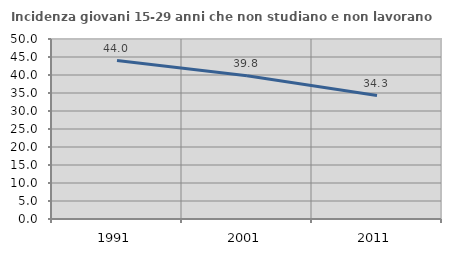
| Category | Incidenza giovani 15-29 anni che non studiano e non lavorano  |
|---|---|
| 1991.0 | 44.019 |
| 2001.0 | 39.789 |
| 2011.0 | 34.299 |